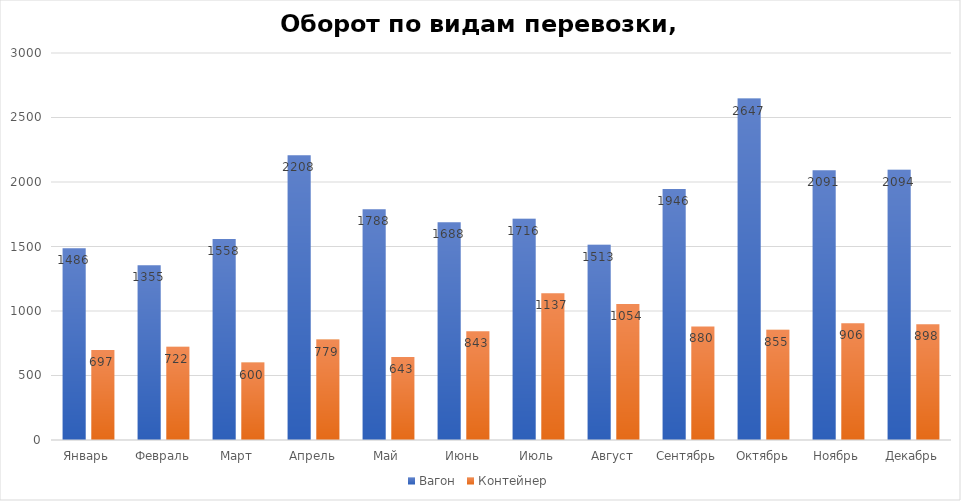
| Category | Вагон | Контейнер |
|---|---|---|
| Январь | 1486 | 697 |
| Февраль | 1355 | 722 |
| Март | 1558 | 600 |
| Апрель | 2208 | 779 |
| Май | 1788 | 643 |
| Июнь | 1688 | 843 |
| Июль | 1716 | 1137 |
| Август | 1513 | 1054 |
| Сентябрь | 1946 | 880 |
| Октябрь | 2647 | 855 |
| Ноябрь | 2091 | 906 |
| Декабрь | 2094 | 898 |